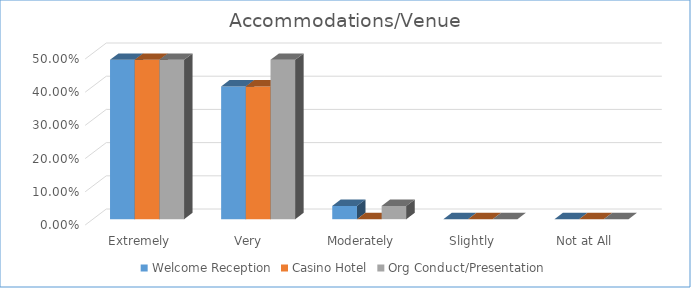
| Category | Welcome Reception | Casino Hotel | Org Conduct/Presentation |
|---|---|---|---|
| Extremely | 0.48 | 0.48 | 0.48 |
| Very  | 0.4 | 0.4 | 0.48 |
| Moderately | 0.04 | 0 | 0.04 |
| Slightly | 0 | 0 | 0 |
| Not at All | 0 | 0 | 0 |